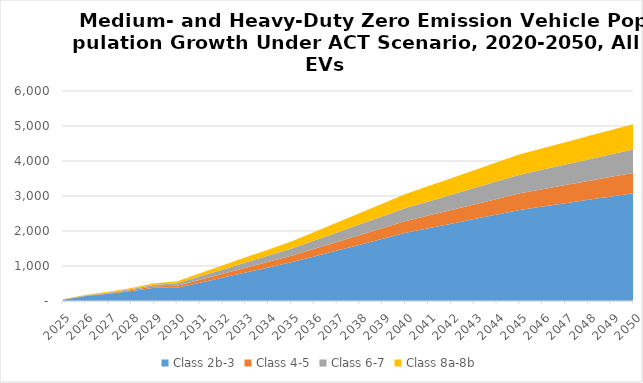
| Category | Class 2b-3 | Class 4-5 | Class 6-7 | Class 8a-8b |
|---|---|---|---|---|
| 2025.0 | 32.928 | 5.316 | 5.642 | 5.081 |
| 2026.0 | 140.458 | 11.433 | 12.284 | 10.837 |
| 2027.0 | 205.544 | 18.819 | 20.466 | 17.646 |
| 2028.0 | 283.891 | 28.83 | 31.728 | 26.147 |
| 2029.0 | 377.927 | 42.069 | 46.843 | 36.812 |
| 2030.0 | 378.082 | 60.025 | 67.61 | 59.099 |
| 2031.0 | 523.335 | 85.229 | 95.365 | 88.195 |
| 2032.0 | 668.589 | 110.433 | 123.12 | 117.292 |
| 2033.0 | 813.842 | 135.637 | 150.875 | 146.388 |
| 2034.0 | 959.095 | 160.841 | 178.63 | 175.484 |
| 2035.0 | 1104.349 | 186.044 | 206.385 | 204.58 |
| 2036.0 | 1273.093 | 216.321 | 238.98 | 243.59 |
| 2037.0 | 1441.836 | 246.598 | 271.575 | 282.599 |
| 2038.0 | 1610.58 | 276.875 | 304.171 | 321.608 |
| 2039.0 | 1779.324 | 307.152 | 336.766 | 360.618 |
| 2040.0 | 1948.068 | 337.429 | 369.362 | 399.627 |
| 2041.0 | 2078.563 | 364.858 | 402.451 | 436.423 |
| 2042.0 | 2209.059 | 392.287 | 435.54 | 473.219 |
| 2043.0 | 2339.554 | 419.717 | 468.629 | 510.015 |
| 2044.0 | 2470.05 | 447.146 | 501.719 | 546.811 |
| 2045.0 | 2600.545 | 474.575 | 534.808 | 583.607 |
| 2046.0 | 2697.139 | 495.823 | 562.035 | 610.949 |
| 2047.0 | 2793.732 | 517.071 | 589.263 | 638.291 |
| 2048.0 | 2890.326 | 538.32 | 616.49 | 665.634 |
| 2049.0 | 2986.919 | 559.568 | 643.718 | 692.976 |
| 2050.0 | 3083.513 | 580.816 | 670.945 | 720.318 |